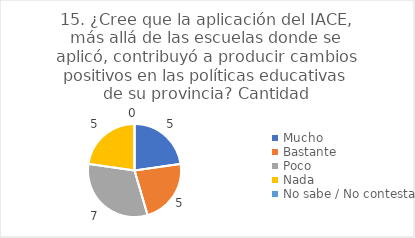
| Category | 15. ¿Cree que la aplicación del IACE, más allá de las escuelas donde se aplicó, contribuyó a producir cambios positivos en las políticas educativas de su provincia? |
|---|---|
| Mucho  | 0.227 |
| Bastante  | 0.227 |
| Poco  | 0.318 |
| Nada  | 0.227 |
| No sabe / No contesta | 0 |